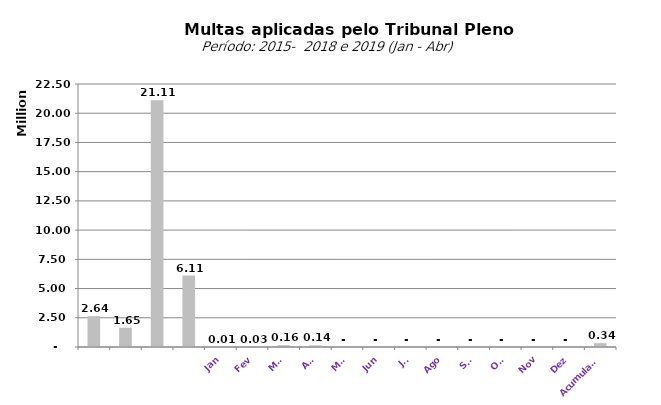
| Category |  1.528.442,62   1.020.189,59   955.160,44   1.276.425,53   2.644.178,81   1.648.289,39   21.112.065,42   6.109.976,68   8.587,38   28.774,76   156.096,39   142.268,21   -     -     -     -     -     -     -     -    |
|---|---|
|  | 2644178.81 |
|  | 1648289.39 |
|  | 21112065.42 |
|  | 6109976.68 |
| Jan | 8587.38 |
| Fev | 28774.76 |
| Mar | 156096.39 |
| Abr | 142268.21 |
| Mai | 0 |
| Jun | 0 |
| Jul | 0 |
| Ago | 0 |
| Set | 0 |
| Out | 0 |
| Nov | 0 |
| Dez | 0 |
| Acumulado | 335726.74 |